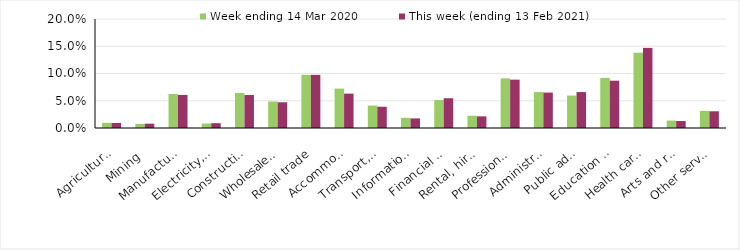
| Category | Week ending 14 Mar 2020 | This week (ending 13 Feb 2021) |
|---|---|---|
| Agriculture, forestry and fishing | 0.01 | 0.009 |
| Mining | 0.008 | 0.008 |
| Manufacturing | 0.062 | 0.061 |
| Electricity, gas, water and waste services | 0.008 | 0.009 |
| Construction | 0.064 | 0.06 |
| Wholesale trade | 0.049 | 0.047 |
| Retail trade | 0.098 | 0.098 |
| Accommodation and food services | 0.072 | 0.063 |
| Transport, postal and warehousing | 0.041 | 0.039 |
| Information media and telecommunications | 0.019 | 0.018 |
| Financial and insurance services | 0.051 | 0.055 |
| Rental, hiring and real estate services | 0.022 | 0.021 |
| Professional, scientific and technical services | 0.091 | 0.089 |
| Administrative and support services | 0.066 | 0.065 |
| Public administration and safety | 0.06 | 0.066 |
| Education and training | 0.092 | 0.087 |
| Health care and social assistance | 0.138 | 0.147 |
| Arts and recreation services | 0.014 | 0.013 |
| Other services | 0.032 | 0.031 |